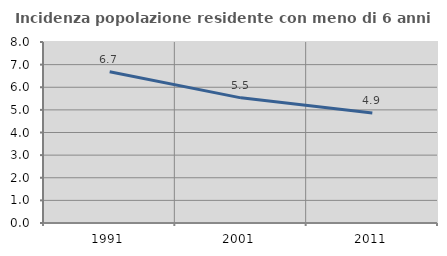
| Category | Incidenza popolazione residente con meno di 6 anni |
|---|---|
| 1991.0 | 6.689 |
| 2001.0 | 5.532 |
| 2011.0 | 4.863 |